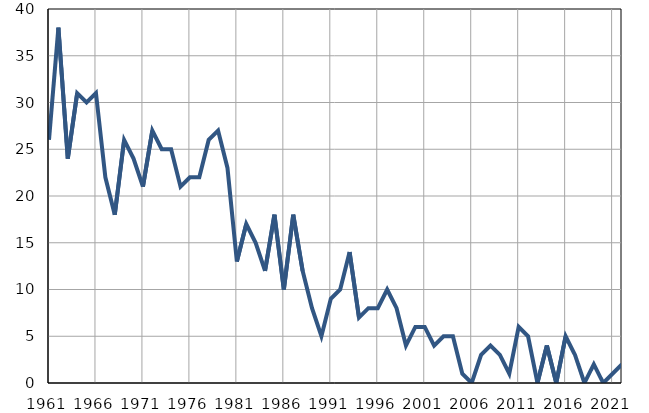
| Category | Умрла 
одојчад |
|---|---|
| 1961.0 | 26 |
| 1962.0 | 38 |
| 1963.0 | 24 |
| 1964.0 | 31 |
| 1965.0 | 30 |
| 1966.0 | 31 |
| 1967.0 | 22 |
| 1968.0 | 18 |
| 1969.0 | 26 |
| 1970.0 | 24 |
| 1971.0 | 21 |
| 1972.0 | 27 |
| 1973.0 | 25 |
| 1974.0 | 25 |
| 1975.0 | 21 |
| 1976.0 | 22 |
| 1977.0 | 22 |
| 1978.0 | 26 |
| 1979.0 | 27 |
| 1980.0 | 23 |
| 1981.0 | 13 |
| 1982.0 | 17 |
| 1983.0 | 15 |
| 1984.0 | 12 |
| 1985.0 | 18 |
| 1986.0 | 10 |
| 1987.0 | 18 |
| 1988.0 | 12 |
| 1989.0 | 8 |
| 1990.0 | 5 |
| 1991.0 | 9 |
| 1992.0 | 10 |
| 1993.0 | 14 |
| 1994.0 | 7 |
| 1995.0 | 8 |
| 1996.0 | 8 |
| 1997.0 | 10 |
| 1998.0 | 8 |
| 1999.0 | 4 |
| 2000.0 | 6 |
| 2001.0 | 6 |
| 2002.0 | 4 |
| 2003.0 | 5 |
| 2004.0 | 5 |
| 2005.0 | 1 |
| 2006.0 | 0 |
| 2007.0 | 3 |
| 2008.0 | 4 |
| 2009.0 | 3 |
| 2010.0 | 1 |
| 2011.0 | 6 |
| 2012.0 | 5 |
| 2013.0 | 0 |
| 2014.0 | 4 |
| 2015.0 | 0 |
| 2016.0 | 5 |
| 2017.0 | 3 |
| 2018.0 | 0 |
| 2019.0 | 2 |
| 2020.0 | 0 |
| 2021.0 | 1 |
| 2022.0 | 2 |